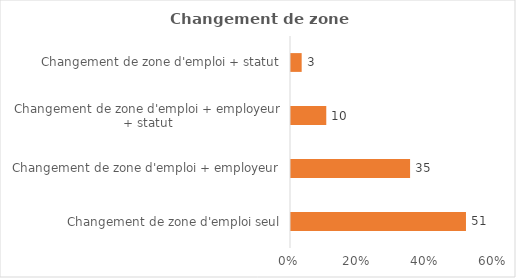
| Category | Series 0 |
|---|---|
| Changement de zone d'emploi seul | 51.463 |
| Changement de zone d'emploi + employeur | 35.024 |
| Changement de zone d'emploi + employeur + statut | 10.374 |
| Changement de zone d'emploi + statut | 3.139 |